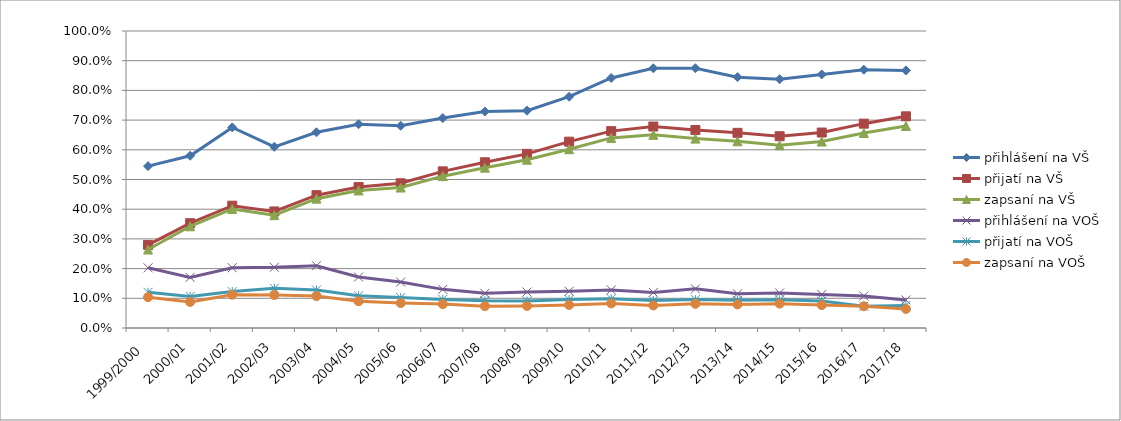
| Category | přihlášení na VŠ | přijatí na VŠ | zapsaní na VŠ | přihlášení na VOŠ | přijatí na VOŠ | zapsaní na VOŠ |
|---|---|---|---|---|---|---|
| 1999/2000 | 0.545 | 0.28 | 0.264 | 0.203 | 0.12 | 0.104 |
| 2000/01 | 0.58 | 0.353 | 0.342 | 0.17 | 0.106 | 0.088 |
| 2001/02 | 0.675 | 0.412 | 0.401 | 0.203 | 0.123 | 0.112 |
| 2002/03 | 0.61 | 0.392 | 0.38 | 0.205 | 0.134 | 0.111 |
| 2003/04 | 0.659 | 0.447 | 0.436 | 0.21 | 0.128 | 0.107 |
| 2004/05 | 0.686 | 0.475 | 0.463 | 0.172 | 0.108 | 0.09 |
| 2005/06 | 0.681 | 0.487 | 0.473 | 0.155 | 0.102 | 0.084 |
| 2006/07 | 0.707 | 0.527 | 0.511 | 0.13 | 0.096 | 0.08 |
| 2007/08 | 0.729 | 0.558 | 0.54 | 0.117 | 0.092 | 0.073 |
| 2008/09 | 0.732 | 0.586 | 0.567 | 0.121 | 0.091 | 0.074 |
| 2009/10 | 0.779 | 0.627 | 0.602 | 0.124 | 0.096 | 0.078 |
| 2010/11 | 0.842 | 0.663 | 0.64 | 0.128 | 0.099 | 0.083 |
| 2011/12 | 0.874 | 0.678 | 0.65 | 0.12 | 0.092 | 0.076 |
| 2012/13 | 0.875 | 0.667 | 0.638 | 0.132 | 0.096 | 0.082 |
| 2013/14 | 0.845 | 0.657 | 0.629 | 0.115 | 0.093 | 0.079 |
| 2014/15 | 0.838 | 0.646 | 0.615 | 0.118 | 0.095 | 0.082 |
| 2015/16 | 0.854 | 0.658 | 0.628 | 0.113 | 0.091 | 0.077 |
| 2016/17 | 0.87 | 0.688 | 0.657 | 0.108 | 0.073 | 0.073 |
| 2017/18 | 0.867 | 0.713 | 0.68 | 0.095 | 0.076 | 0.064 |